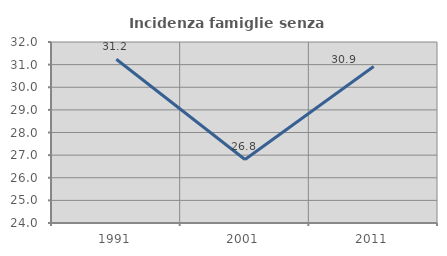
| Category | Incidenza famiglie senza nuclei |
|---|---|
| 1991.0 | 31.237 |
| 2001.0 | 26.808 |
| 2011.0 | 30.92 |